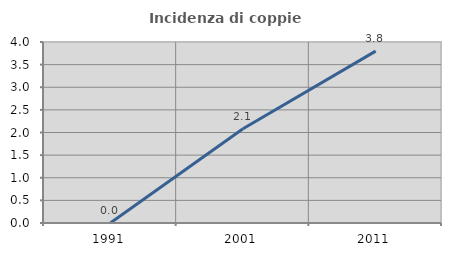
| Category | Incidenza di coppie miste |
|---|---|
| 1991.0 | 0 |
| 2001.0 | 2.083 |
| 2011.0 | 3.797 |